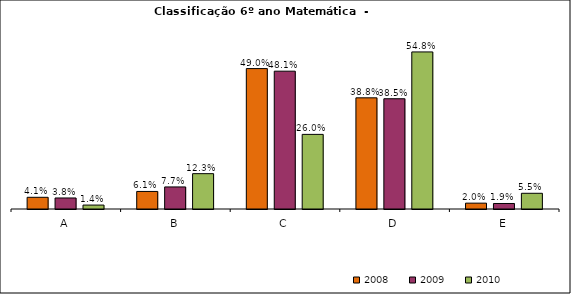
| Category | 2008 | 2009 | 2010 |
|---|---|---|---|
| A | 0.041 | 0.038 | 0.014 |
| B | 0.061 | 0.077 | 0.123 |
| C | 0.49 | 0.481 | 0.26 |
| D | 0.388 | 0.385 | 0.548 |
| E | 0.02 | 0.019 | 0.055 |